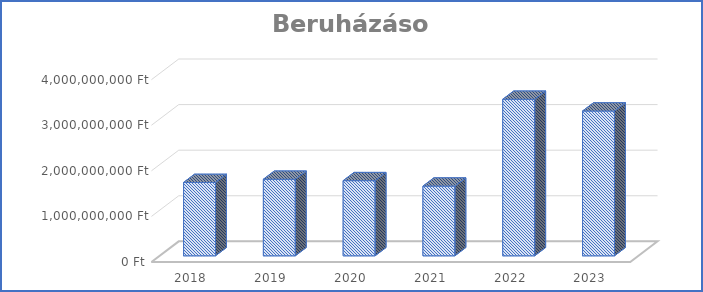
| Category | Beruházások |
|---|---|
| 2018.0 | 1609075178 |
| 2019.0 | 1679066594 |
| 2020.0 | 1648508317 |
| 2021.0 | 1529139710 |
| 2022.0 | 3433628329 |
| 2023.0 | 3176181280 |